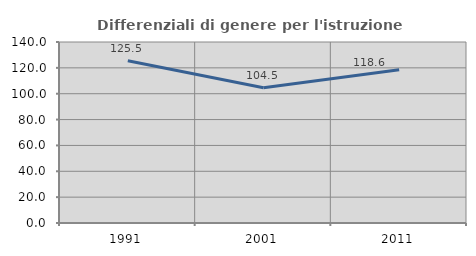
| Category | Differenziali di genere per l'istruzione superiore |
|---|---|
| 1991.0 | 125.529 |
| 2001.0 | 104.548 |
| 2011.0 | 118.565 |